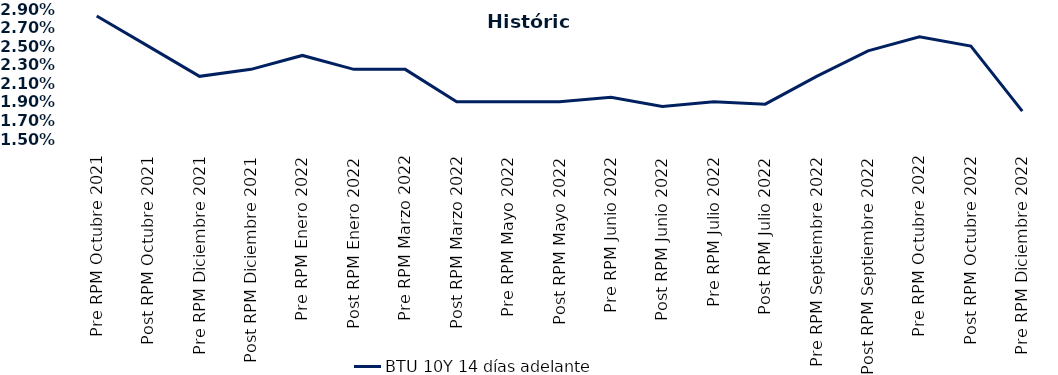
| Category | BTU 10Y 14 días adelante |
|---|---|
| Pre RPM Octubre 2021 | 0.028 |
| Post RPM Octubre 2021 | 0.025 |
| Pre RPM Diciembre 2021 | 0.022 |
| Post RPM Diciembre 2021 | 0.022 |
| Pre RPM Enero 2022 | 0.024 |
| Post RPM Enero 2022 | 0.022 |
| Pre RPM Marzo 2022 | 0.022 |
| Post RPM Marzo 2022 | 0.019 |
| Pre RPM Mayo 2022 | 0.019 |
| Post RPM Mayo 2022 | 0.019 |
| Pre RPM Junio 2022 | 0.02 |
| Post RPM Junio 2022 | 0.018 |
| Pre RPM Julio 2022 | 0.019 |
| Post RPM Julio 2022 | 0.019 |
| Pre RPM Septiembre 2022 | 0.022 |
| Post RPM Septiembre 2022 | 0.024 |
| Pre RPM Octubre 2022 | 0.026 |
| Post RPM Octubre 2022 | 0.025 |
| Pre RPM Diciembre 2022 | 0.018 |